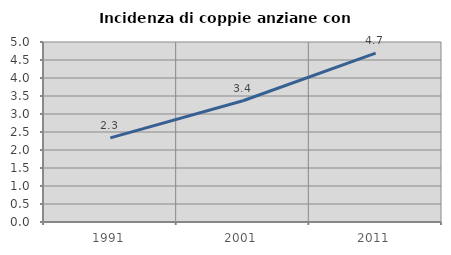
| Category | Incidenza di coppie anziane con figli |
|---|---|
| 1991.0 | 2.337 |
| 2001.0 | 3.368 |
| 2011.0 | 4.69 |